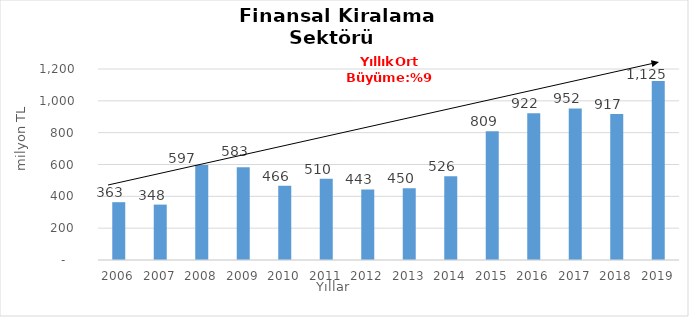
| Category | Finansal Kiralama  |
|---|---|
| 2006.0 | 363.206 |
| 2007.0 | 348.066 |
| 2008.0 | 596.686 |
| 2009.0 | 582.74 |
| 2010.0 | 466.416 |
| 2011.0 | 509.999 |
| 2012.0 | 443.41 |
| 2013.0 | 450.17 |
| 2014.0 | 525.856 |
| 2015.0 | 809 |
| 2016.0 | 922 |
| 2017.0 | 952 |
| 2018.0 | 917 |
| 2019.0 | 1125 |